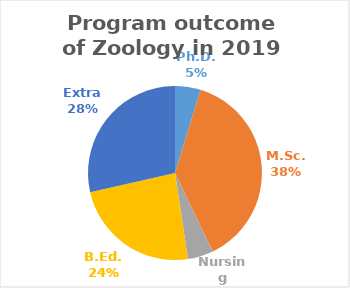
| Category | Series 0 |
|---|---|
| Ph.D. | 1 |
| M.Sc. | 8 |
| Nursing | 1 |
| B.Ed. | 5 |
| Extra | 6 |